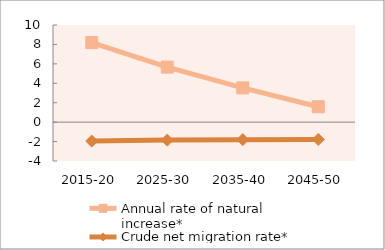
| Category | Annual rate of natural increase* | Crude net migration rate* |
|---|---|---|
| 2015-20 | 8.189 | -1.945 |
| 2025-30 | 5.662 | -1.85 |
| 2035-40 | 3.527 | -1.8 |
| 2045-50 | 1.589 | -1.786 |